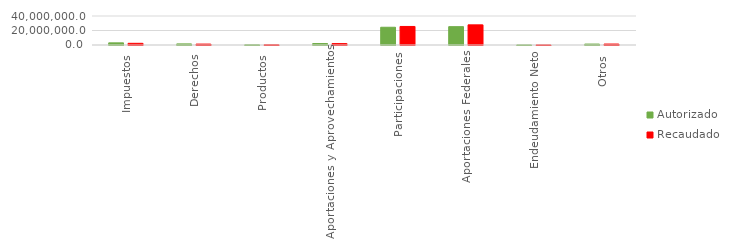
| Category | Autorizado | Recaudado |
|---|---|---|
| Impuestos | 2958456 | 2325280.5 |
| Derechos | 1496579 | 1249933.5 |
| Productos | 327125 | 343297 |
| Aportaciones y Aprovechamientos | 2020471 | 1926752 |
| Participaciones | 24472476 | 25581184.9 |
| Aportaciones Federales | 25297654 | 27788360.1 |
| Endeudamiento Neto | 140657 | 113318.2 |
| Otros | 1291132 | 1293366.8 |